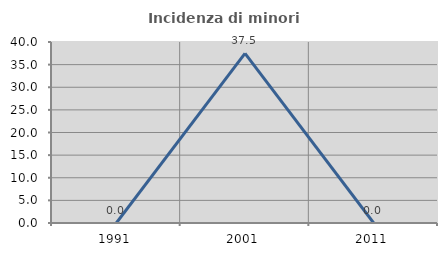
| Category | Incidenza di minori stranieri |
|---|---|
| 1991.0 | 0 |
| 2001.0 | 37.5 |
| 2011.0 | 0 |